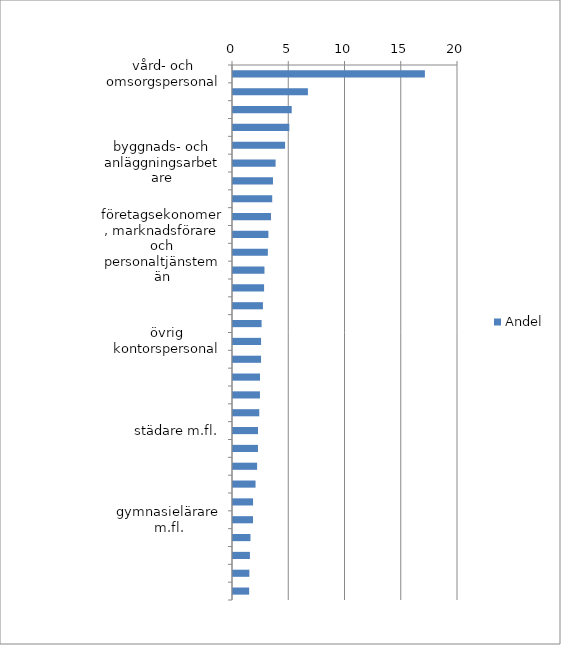
| Category | Andel |
|---|---|
| vård- och omsorgspersonal | 17.057 |
| försäljare, detaljhandel; demonstratörer m.fl. | 6.66 |
| yrke okänt | 5.218 |
| säljare, inköpare, mäklare m.fl. | 5.006 |
| ingenjörer och tekniker | 4.629 |
| byggnads- och anläggningsarbetare | 3.786 |
| byggnadshantverkare | 3.553 |
| universitets- och högskollärare | 3.486 |
| dataspecialister | 3.377 |
| fordonsförare | 3.148 |
| företagsekonomer, marknadsförare och personaltjänstemän | 3.097 |
| redovisningsekonomer, administrativa assistenter m.fl. | 2.797 |
| sjuksköterskor | 2.763 |
| drift- och verksamhetschefer | 2.662 |
| grundskollärare | 2.541 |
| övrig kontorspersonal | 2.496 |
| civilingenjörer, arkitekter m.fl. | 2.493 |
| hälso- och sjukvårdsspecialister | 2.402 |
| förskollärare och fritidspedagoger | 2.397 |
| administratörer i offentlig förvaltning | 2.336 |
| städare m.fl. | 2.22 |
| köks- och restaurangbiträden | 2.219 |
| chefer för mindre företag och enheter | 2.143 |
| chefer för särskilda funktioner | 2.004 |
| storhushålls- och restaurangpersonal | 1.783 |
| gymnasielärare m.fl. | 1.779 |
| lager- och transportassistenter | 1.553 |
| maskin- och motorreparatörer | 1.503 |
| bokförings- och redovisningsassistenter | 1.455 |
| säkerhetspersonal | 1.437 |